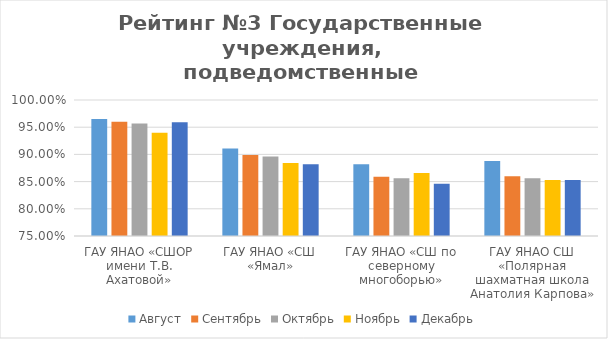
| Category | Август | Сентябрь | Октябрь | Ноябрь | Декабрь |
|---|---|---|---|---|---|
| ГАУ ЯНАО «СШОР имени Т.В. Ахатовой» | 0.965 | 0.96 | 0.957 | 0.94 | 0.959 |
| ГАУ ЯНАО «СШ «Ямал» | 0.911 | 0.899 | 0.896 | 0.884 | 0.882 |
| ГАУ ЯНАО «СШ по северному многоборью» | 0.882 | 0.859 | 0.856 | 0.866 | 0.846 |
| ГАУ ЯНАО СШ «Полярная шахматная школа Анатолия Карпова» | 0.888 | 0.86 | 0.856 | 0.853 | 0.853 |